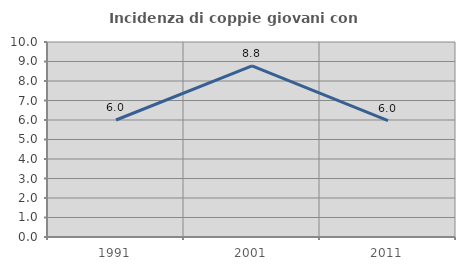
| Category | Incidenza di coppie giovani con figli |
|---|---|
| 1991.0 | 6 |
| 2001.0 | 8.772 |
| 2011.0 | 5.97 |